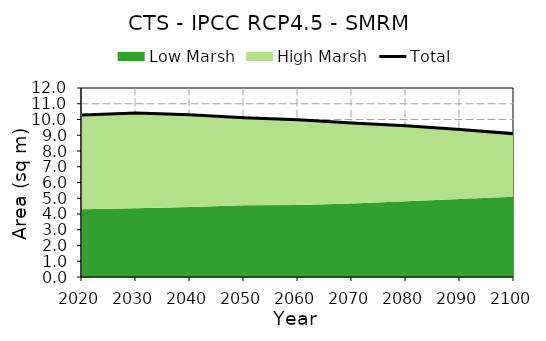
| Category | Total |
|---|---|
| 0 | 10.286 |
| 1 | 10.406 |
| 2 | 10.308 |
| 3 | 10.118 |
| 4 | 9.978 |
| 5 | 9.774 |
| 6 | 9.605 |
| 7 | 9.362 |
| 8 | 9.098 |